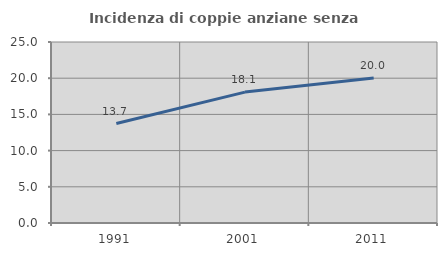
| Category | Incidenza di coppie anziane senza figli  |
|---|---|
| 1991.0 | 13.733 |
| 2001.0 | 18.082 |
| 2011.0 | 20.014 |